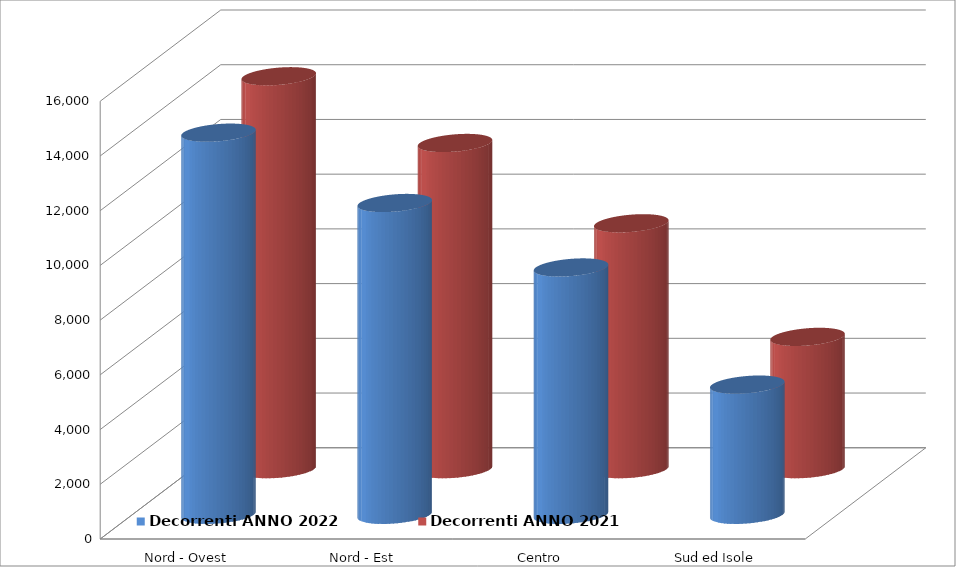
| Category | Decorrenti ANNO 2022 | Decorrenti ANNO 2021 |
|---|---|---|
| Nord - Ovest | 13967 | 14362 |
| Nord - Est | 11397 | 11923 |
| Centro | 9040 | 8988 |
| Sud ed Isole | 4759 | 4836 |